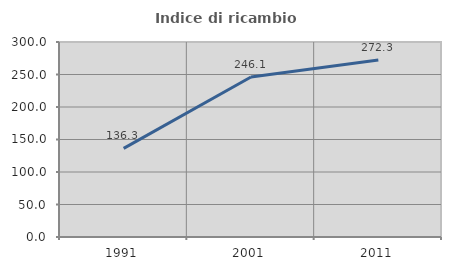
| Category | Indice di ricambio occupazionale  |
|---|---|
| 1991.0 | 136.283 |
| 2001.0 | 246.053 |
| 2011.0 | 272.34 |